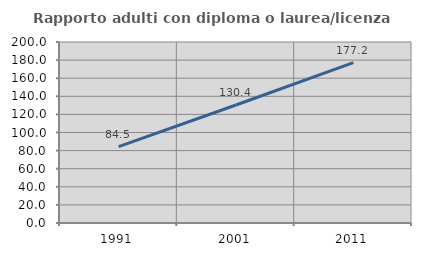
| Category | Rapporto adulti con diploma o laurea/licenza media  |
|---|---|
| 1991.0 | 84.477 |
| 2001.0 | 130.399 |
| 2011.0 | 177.195 |